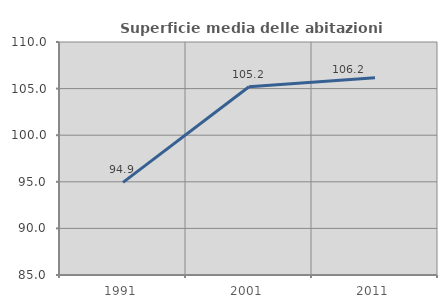
| Category | Superficie media delle abitazioni occupate |
|---|---|
| 1991.0 | 94.933 |
| 2001.0 | 105.199 |
| 2011.0 | 106.157 |